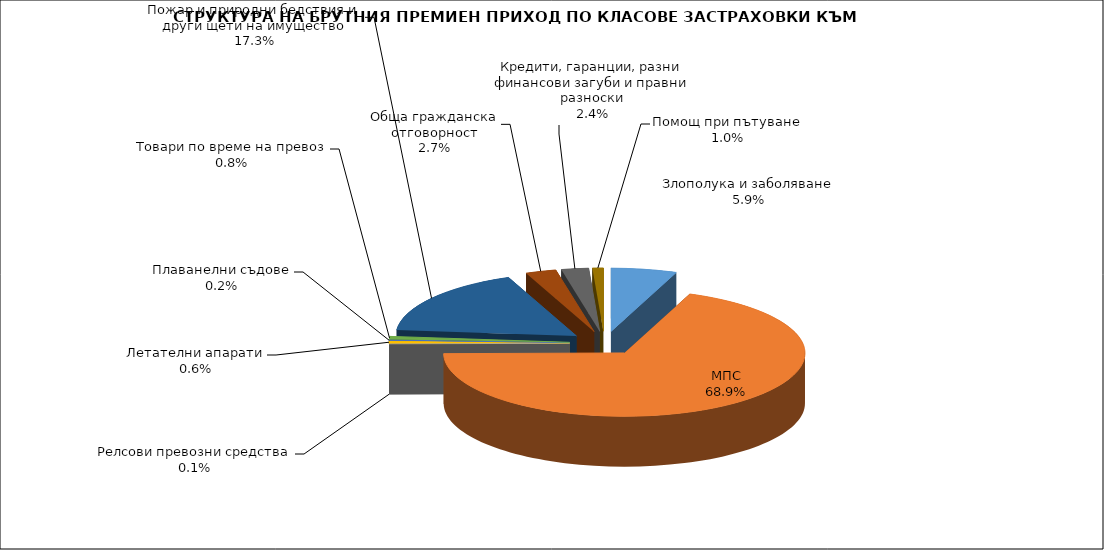
| Category | Злополука и заболяване |
|---|---|
| Злополука и заболяване | 0.059 |
| МПС | 0.689 |
| Релсови превозни средства | 0.001 |
| Летателни апарати | 0.006 |
| Плаванелни съдове | 0.002 |
| Товари по време на превоз | 0.008 |
| Пожар и природни бедствия и други щети на имущество | 0.173 |
| Обща гражданска отговорност | 0.027 |
| Кредити, гаранции, разни финансови загуби и правни разноски | 0.024 |
| Помощ при пътуване | 0.01 |